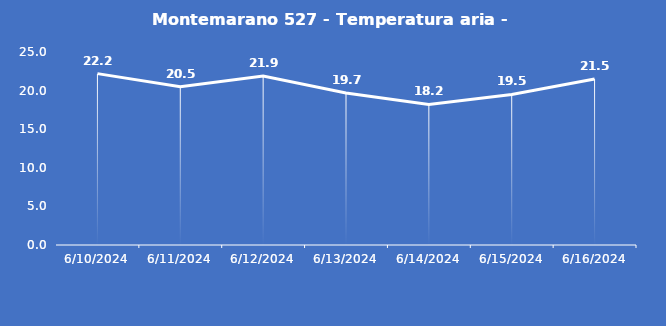
| Category | Montemarano 527 - Temperatura aria - Grezzo (°C) |
|---|---|
| 6/10/24 | 22.2 |
| 6/11/24 | 20.5 |
| 6/12/24 | 21.9 |
| 6/13/24 | 19.7 |
| 6/14/24 | 18.2 |
| 6/15/24 | 19.5 |
| 6/16/24 | 21.5 |